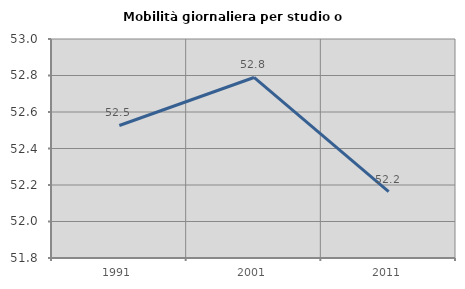
| Category | Mobilità giornaliera per studio o lavoro |
|---|---|
| 1991.0 | 52.526 |
| 2001.0 | 52.789 |
| 2011.0 | 52.163 |